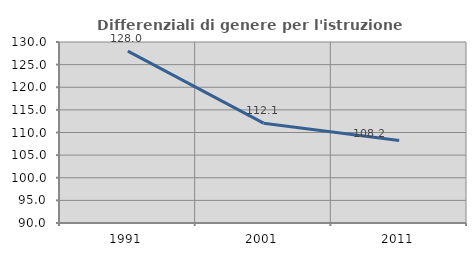
| Category | Differenziali di genere per l'istruzione superiore |
|---|---|
| 1991.0 | 127.998 |
| 2001.0 | 112.06 |
| 2011.0 | 108.209 |